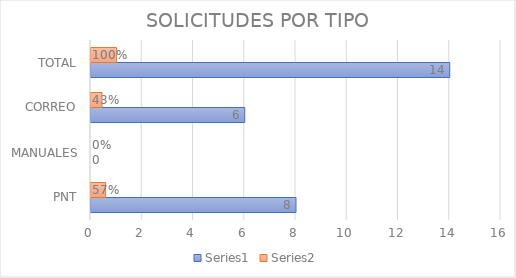
| Category | Series 0 | Series 1 |
|---|---|---|
| PNT | 8 | 0.571 |
| MANUALES | 0 | 0 |
| CORREO | 6 | 0.429 |
| TOTAL | 14 | 1 |